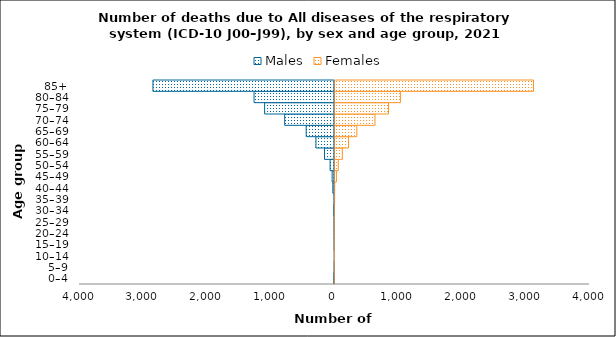
| Category | Males | Females |
|---|---|---|
| 0–4 | -9 | 6 |
| 5–9 | -2 | 3 |
| 10–14 | 0 | 1 |
| 15–19 | -3 | 4 |
| 20–24 | -4 | 2 |
| 25–29 | -6 | 4 |
| 30–34 | -11 | 8 |
| 35–39 | -7 | 10 |
| 40–44 | -26 | 11 |
| 45–49 | -37 | 38 |
| 50–54 | -69 | 67 |
| 55–59 | -156 | 131 |
| 60–64 | -291 | 228 |
| 65–69 | -444 | 358 |
| 70–74 | -782 | 643 |
| 75–79 | -1096 | 855 |
| 80–84 | -1262 | 1042 |
| 85+ | -2848 | 3129 |